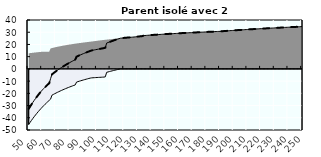
| Category | Coin fiscal moyen (somme des composantes) | Taux moyen d'imposition net en % du salaire brut |
|---|---|---|
| 50.0 | -32.732 | -32.732 |
| 51.0 | -30.906 | -30.906 |
| 52.0 | -29.15 | -29.15 |
| 53.0 | -27.461 | -27.461 |
| 54.0 | -25.834 | -25.834 |
| 55.0 | -24.266 | -24.266 |
| 56.0 | -22.754 | -22.754 |
| 57.0 | -21.295 | -21.295 |
| 58.0 | -19.887 | -19.887 |
| 59.0 | -18.526 | -18.526 |
| 60.0 | -17.245 | -17.245 |
| 61.0 | -16.071 | -16.071 |
| 62.0 | -14.934 | -14.934 |
| 63.0 | -13.833 | -13.833 |
| 64.0 | -12.767 | -12.767 |
| 65.0 | -11.734 | -11.734 |
| 66.0 | -8.02 | -8.02 |
| 67.0 | -4.509 | -4.509 |
| 68.0 | -3.619 | -3.619 |
| 69.0 | -2.755 | -2.755 |
| 70.0 | -1.916 | -1.916 |
| 71.0 | -1.112 | -1.112 |
| 72.0 | -0.34 | -0.34 |
| 73.0 | 0.411 | 0.411 |
| 74.0 | 1.142 | 1.142 |
| 75.0 | 1.854 | 1.854 |
| 76.0 | 2.546 | 2.546 |
| 77.0 | 3.221 | 3.221 |
| 78.0 | 3.879 | 3.879 |
| 79.0 | 4.519 | 4.519 |
| 80.0 | 5.144 | 5.144 |
| 81.0 | 5.753 | 5.753 |
| 82.0 | 6.348 | 6.348 |
| 83.0 | 6.928 | 6.928 |
| 84.0 | 7.494 | 7.494 |
| 85.0 | 10.007 | 10.007 |
| 86.0 | 10.524 | 10.524 |
| 87.0 | 11.029 | 11.029 |
| 88.0 | 11.523 | 11.523 |
| 89.0 | 12.006 | 12.006 |
| 90.0 | 12.478 | 12.478 |
| 91.0 | 12.94 | 12.94 |
| 92.0 | 13.392 | 13.392 |
| 93.0 | 13.834 | 13.834 |
| 94.0 | 14.267 | 14.267 |
| 95.0 | 14.69 | 14.69 |
| 96.0 | 15.051 | 15.051 |
| 97.0 | 15.283 | 15.283 |
| 98.0 | 15.51 | 15.51 |
| 99.0 | 15.732 | 15.732 |
| 100.0 | 15.949 | 15.949 |
| 101.0 | 16.163 | 16.163 |
| 102.0 | 16.372 | 16.372 |
| 103.0 | 16.577 | 16.577 |
| 104.0 | 16.778 | 16.778 |
| 105.0 | 16.976 | 16.976 |
| 106.0 | 17.319 | 17.319 |
| 107.0 | 21.139 | 21.139 |
| 108.0 | 21.568 | 21.568 |
| 109.0 | 21.989 | 21.989 |
| 110.0 | 22.403 | 22.403 |
| 111.0 | 22.809 | 22.809 |
| 112.0 | 23.208 | 23.208 |
| 113.0 | 23.6 | 23.6 |
| 114.0 | 23.985 | 23.985 |
| 115.0 | 24.364 | 24.364 |
| 116.0 | 24.736 | 24.736 |
| 117.0 | 25.101 | 25.101 |
| 118.0 | 25.209 | 25.209 |
| 119.0 | 25.312 | 25.312 |
| 120.0 | 25.413 | 25.413 |
| 121.0 | 25.513 | 25.513 |
| 122.0 | 25.612 | 25.612 |
| 123.0 | 25.708 | 25.708 |
| 124.0 | 25.803 | 25.803 |
| 125.0 | 25.897 | 25.897 |
| 126.0 | 25.989 | 25.989 |
| 127.0 | 26.089 | 26.089 |
| 128.0 | 26.213 | 26.213 |
| 129.0 | 26.336 | 26.336 |
| 130.0 | 26.456 | 26.456 |
| 131.0 | 26.575 | 26.575 |
| 132.0 | 26.692 | 26.692 |
| 133.0 | 26.807 | 26.807 |
| 134.0 | 27.23 | 27.23 |
| 135.0 | 27.318 | 27.318 |
| 136.0 | 27.403 | 27.403 |
| 137.0 | 27.488 | 27.488 |
| 138.0 | 27.572 | 27.572 |
| 139.0 | 27.654 | 27.654 |
| 140.0 | 27.735 | 27.735 |
| 141.0 | 27.815 | 27.815 |
| 142.0 | 27.893 | 27.893 |
| 143.0 | 27.971 | 27.971 |
| 144.0 | 28.048 | 28.048 |
| 145.0 | 28.123 | 28.123 |
| 146.0 | 28.198 | 28.198 |
| 147.0 | 28.271 | 28.271 |
| 148.0 | 28.344 | 28.344 |
| 149.0 | 28.415 | 28.415 |
| 150.0 | 28.486 | 28.486 |
| 151.0 | 28.555 | 28.555 |
| 152.0 | 28.624 | 28.624 |
| 153.0 | 28.692 | 28.692 |
| 154.0 | 28.759 | 28.759 |
| 155.0 | 28.825 | 28.825 |
| 156.0 | 28.89 | 28.89 |
| 157.0 | 28.955 | 28.955 |
| 158.0 | 29.018 | 29.018 |
| 159.0 | 29.081 | 29.081 |
| 160.0 | 29.143 | 29.143 |
| 161.0 | 29.204 | 29.204 |
| 162.0 | 29.265 | 29.265 |
| 163.0 | 29.324 | 29.324 |
| 164.0 | 29.383 | 29.383 |
| 165.0 | 29.442 | 29.442 |
| 166.0 | 29.499 | 29.499 |
| 167.0 | 29.556 | 29.556 |
| 168.0 | 29.612 | 29.612 |
| 169.0 | 29.668 | 29.668 |
| 170.0 | 29.723 | 29.723 |
| 171.0 | 29.777 | 29.777 |
| 172.0 | 29.831 | 29.831 |
| 173.0 | 29.884 | 29.884 |
| 174.0 | 29.936 | 29.936 |
| 175.0 | 29.988 | 29.988 |
| 176.0 | 30.039 | 30.039 |
| 177.0 | 30.09 | 30.09 |
| 178.0 | 30.14 | 30.14 |
| 179.0 | 30.189 | 30.189 |
| 180.0 | 30.238 | 30.238 |
| 181.0 | 30.287 | 30.287 |
| 182.0 | 30.334 | 30.334 |
| 183.0 | 30.382 | 30.382 |
| 184.0 | 30.429 | 30.429 |
| 185.0 | 30.475 | 30.475 |
| 186.0 | 30.521 | 30.521 |
| 187.0 | 30.566 | 30.566 |
| 188.0 | 30.611 | 30.611 |
| 189.0 | 30.655 | 30.655 |
| 190.0 | 30.699 | 30.699 |
| 191.0 | 30.78 | 30.78 |
| 192.0 | 30.865 | 30.865 |
| 193.0 | 30.948 | 30.948 |
| 194.0 | 31.031 | 31.031 |
| 195.0 | 31.113 | 31.113 |
| 196.0 | 31.194 | 31.194 |
| 197.0 | 31.274 | 31.274 |
| 198.0 | 31.354 | 31.354 |
| 199.0 | 31.432 | 31.432 |
| 200.0 | 31.51 | 31.51 |
| 201.0 | 31.587 | 31.587 |
| 202.0 | 31.664 | 31.664 |
| 203.0 | 31.739 | 31.739 |
| 204.0 | 31.814 | 31.814 |
| 205.0 | 31.888 | 31.888 |
| 206.0 | 31.961 | 31.961 |
| 207.0 | 32.034 | 32.034 |
| 208.0 | 32.106 | 32.106 |
| 209.0 | 32.177 | 32.177 |
| 210.0 | 32.248 | 32.248 |
| 211.0 | 32.318 | 32.318 |
| 212.0 | 32.387 | 32.387 |
| 213.0 | 32.456 | 32.456 |
| 214.0 | 32.524 | 32.524 |
| 215.0 | 32.591 | 32.591 |
| 216.0 | 32.658 | 32.658 |
| 217.0 | 32.724 | 32.724 |
| 218.0 | 32.789 | 32.789 |
| 219.0 | 32.854 | 32.854 |
| 220.0 | 32.918 | 32.918 |
| 221.0 | 32.982 | 32.982 |
| 222.0 | 33.045 | 33.045 |
| 223.0 | 33.108 | 33.108 |
| 224.0 | 33.17 | 33.17 |
| 225.0 | 33.231 | 33.231 |
| 226.0 | 33.292 | 33.292 |
| 227.0 | 33.353 | 33.353 |
| 228.0 | 33.412 | 33.412 |
| 229.0 | 33.472 | 33.472 |
| 230.0 | 33.531 | 33.531 |
| 231.0 | 33.589 | 33.589 |
| 232.0 | 33.647 | 33.647 |
| 233.0 | 33.704 | 33.704 |
| 234.0 | 33.761 | 33.761 |
| 235.0 | 33.817 | 33.817 |
| 236.0 | 33.873 | 33.873 |
| 237.0 | 33.928 | 33.928 |
| 238.0 | 33.983 | 33.983 |
| 239.0 | 34.038 | 34.038 |
| 240.0 | 34.092 | 34.092 |
| 241.0 | 34.145 | 34.145 |
| 242.0 | 34.198 | 34.198 |
| 243.0 | 34.251 | 34.251 |
| 244.0 | 34.303 | 34.303 |
| 245.0 | 34.355 | 34.355 |
| 246.0 | 34.407 | 34.407 |
| 247.0 | 34.458 | 34.458 |
| 248.0 | 34.508 | 34.508 |
| 249.0 | 34.558 | 34.558 |
| 250.0 | 34.608 | 34.608 |